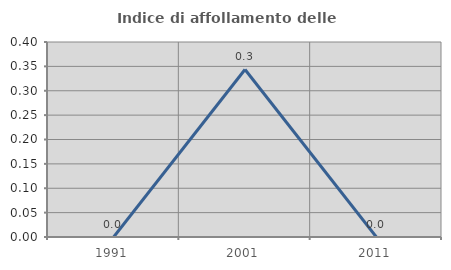
| Category | Indice di affollamento delle abitazioni  |
|---|---|
| 1991.0 | 0 |
| 2001.0 | 0.344 |
| 2011.0 | 0 |